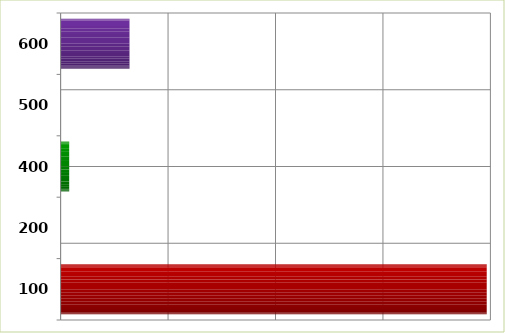
| Category | Series 0 |
|---|---|
| 100.0 | 1982889.34 |
| 200.0 | 0 |
| 400.0 | 40000 |
| 500.0 | 0 |
| 600.0 | 320634.18 |